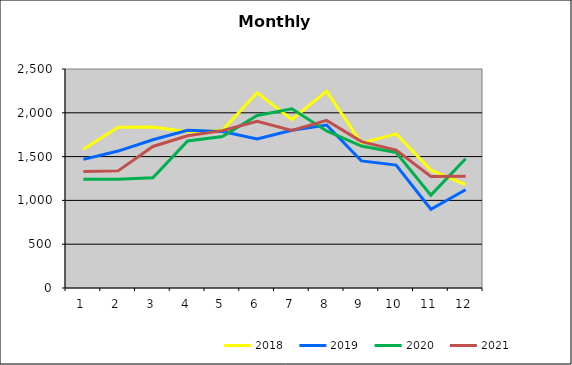
| Category | 2018 | 2019 | 2020 | 2021 |
|---|---|---|---|---|
| 0 | 1584.945 | 1467.961 | 1241.004 | 1328.847 |
| 1 | 1834.566 | 1563.301 | 1241.851 | 1337.03 |
| 2 | 1838.878 | 1692.17 | 1257.948 | 1615.717 |
| 3 | 1785.082 | 1799.954 | 1678.799 | 1737.722 |
| 4 | 1801.761 | 1787.008 | 1728.302 | 1796.563 |
| 5 | 2229.629 | 1700.928 | 1969.438 | 1901.584 |
| 6 | 1923.685 | 1800.379 | 2046.582 | 1797.468 |
| 7 | 2246.519 | 1860.378 | 1792.692 | 1912.975 |
| 8 | 1654.017 | 1451.067 | 1620.398 | 1670.802 |
| 9 | 1760.102 | 1402.587 | 1547.501 | 1573.839 |
| 10 | 1345.712 | 899.124 | 1060.179 | 1273.867 |
| 11 | 1179.594 | 1120.919 | 1476.203 | 1274.307 |